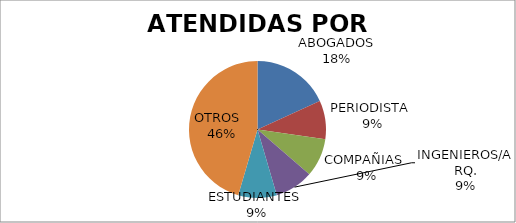
| Category | Series 0 |
|---|---|
| ABOGADOS | 2 |
| PERIODISTA  | 1 |
| COMPAÑIAS  | 1 |
| INGENIEROS/ARQ. | 1 |
| ESTUDIANTES  | 1 |
| OTROS   | 5 |